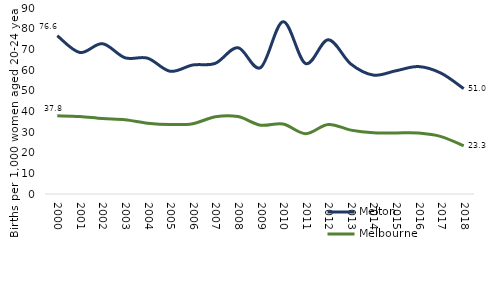
| Category | Melton  | Melbourne  |
|---|---|---|
| 2000.0 | 76.59 | 37.838 |
| 2001.0 | 68.452 | 37.529 |
| 2002.0 | 72.73 | 36.495 |
| 2003.0 | 65.913 | 35.959 |
| 2004.0 | 65.714 | 34.286 |
| 2005.0 | 59.384 | 33.633 |
| 2006.0 | 62.424 | 34.024 |
| 2007.0 | 63.224 | 37.395 |
| 2008.0 | 70.798 | 37.464 |
| 2009.0 | 61.127 | 33.315 |
| 2010.0 | 83.376 | 33.877 |
| 2011.0 | 63.094 | 29.167 |
| 2012.0 | 74.637 | 33.644 |
| 2013.0 | 62.904 | 30.896 |
| 2014.0 | 57.534 | 29.606 |
| 2015.0 | 59.632 | 29.54 |
| 2016.0 | 61.662 | 29.475 |
| 2017.0 | 58.452 | 27.787 |
| 2018.0 | 50.977 | 23.348 |